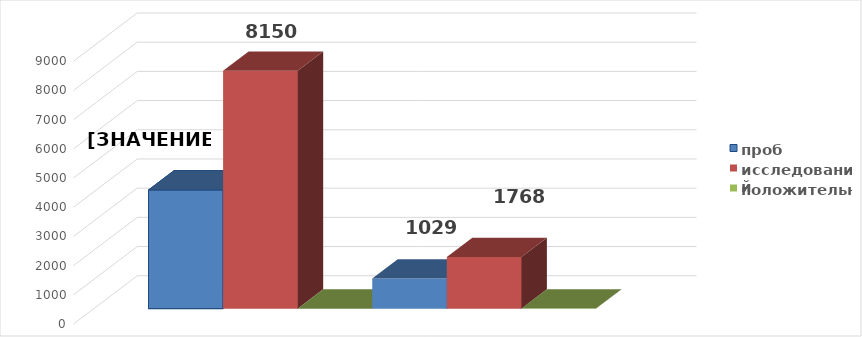
| Category | проб | исследований | положительных | Series 5 | Series 6 |
|---|---|---|---|---|---|
| 0 | 1029 | 8150 | 0 | 1768 | 5 |